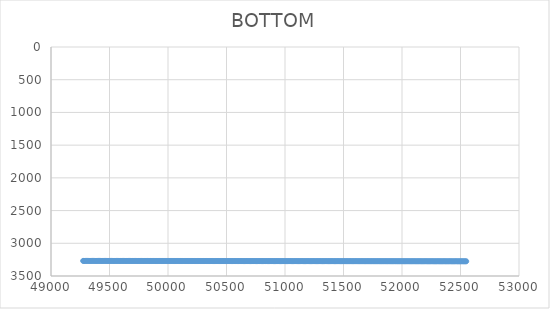
| Category | BOTTOM |
|---|---|
| 49275.0867 | 3269.27 |
| 49282.2205 | 3269.28 |
| 49292.46 | 3269.3 |
| 49302.7001 | 3269.32 |
| 49312.9402 | 3269.33 |
| 49323.1803 | 3269.35 |
| 49333.4204 | 3269.37 |
| 49343.6605 | 3269.39 |
| 49353.9006 | 3269.41 |
| 49364.1407 | 3269.43 |
| 49374.3808 | 3269.45 |
| 49384.6209 | 3269.46 |
| 49394.861 | 3269.48 |
| 49405.1011 | 3269.5 |
| 49415.3412 | 3269.52 |
| 49425.5813 | 3269.54 |
| 49435.8214 | 3269.56 |
| 49446.0615 | 3269.58 |
| 49456.3017 | 3269.59 |
| 49466.5418 | 3269.61 |
| 49476.7819 | 3269.63 |
| 49487.022 | 3269.65 |
| 49497.2621 | 3269.67 |
| 49507.5022 | 3269.69 |
| 49517.7423 | 3269.7 |
| 49527.9824 | 3269.72 |
| 49538.2225 | 3269.74 |
| 49548.4626 | 3269.76 |
| 49558.7027 | 3269.78 |
| 49568.9428 | 3269.8 |
| 49579.1829 | 3269.82 |
| 49589.423 | 3269.83 |
| 49599.6631 | 3269.85 |
| 49609.9032 | 3269.87 |
| 49620.1433 | 3269.89 |
| 49630.3834 | 3269.91 |
| 49640.6235 | 3269.93 |
| 49650.8636 | 3269.95 |
| 49661.1037 | 3269.96 |
| 49671.3438 | 3269.98 |
| 49681.5839 | 3270 |
| 49691.824 | 3270.02 |
| 49702.0641 | 3270.04 |
| 49712.3042 | 3270.06 |
| 49722.5443 | 3270.08 |
| 49732.7844 | 3270.09 |
| 49743.0245 | 3270.11 |
| 49753.2646 | 3270.13 |
| 49763.5047 | 3270.15 |
| 49773.7448 | 3270.17 |
| 49783.9849 | 3270.19 |
| 49794.225 | 3270.21 |
| 49804.4651 | 3270.22 |
| 49814.7052 | 3270.24 |
| 49824.9453 | 3270.26 |
| 49835.1854 | 3270.28 |
| 49845.4255 | 3270.3 |
| 49855.6656 | 3270.32 |
| 49865.9057 | 3270.34 |
| 49876.1458 | 3270.35 |
| 49886.3859 | 3270.37 |
| 49896.626 | 3270.39 |
| 49906.8661 | 3270.41 |
| 49917.1062 | 3270.43 |
| 49927.3463 | 3270.45 |
| 49937.5864 | 3270.46 |
| 49947.8265 | 3270.48 |
| 49958.0666 | 3270.5 |
| 49968.3067 | 3270.52 |
| 49978.5468 | 3270.54 |
| 49988.7869 | 3270.56 |
| 49999.027 | 3270.58 |
| 50009.2671 | 3270.59 |
| 50019.5072 | 3270.61 |
| 50029.7473 | 3270.63 |
| 50039.9874 | 3270.65 |
| 50050.2275 | 3270.67 |
| 50060.4676 | 3270.69 |
| 50070.7077 | 3270.71 |
| 50080.9478 | 3270.72 |
| 50091.1879 | 3270.74 |
| 50101.428 | 3270.76 |
| 50111.6681 | 3270.78 |
| 50121.9082 | 3270.8 |
| 50132.1483 | 3270.82 |
| 50142.3884 | 3270.84 |
| 50152.6285 | 3270.85 |
| 50162.8686 | 3270.87 |
| 50173.1087 | 3270.89 |
| 50183.3488 | 3270.91 |
| 50193.5889 | 3270.93 |
| 50203.8291 | 3270.95 |
| 50214.0692 | 3270.97 |
| 50224.3093 | 3270.98 |
| 50234.5494 | 3271 |
| 50244.7895 | 3271.02 |
| 50255.0296 | 3271.04 |
| 50265.2697 | 3271.06 |
| 50275.5098 | 3271.08 |
| 50285.7499 | 3271.1 |
| 50295.99 | 3271.11 |
| 50306.2301 | 3271.13 |
| 50316.4702 | 3271.15 |
| 50326.7103 | 3271.17 |
| 50336.9504 | 3271.19 |
| 50347.1905 | 3271.21 |
| 50357.4306 | 3271.22 |
| 50367.6707 | 3271.24 |
| 50377.9108 | 3271.26 |
| 50388.1509 | 3271.28 |
| 50398.391 | 3271.3 |
| 50408.6311 | 3271.32 |
| 50418.8712 | 3271.34 |
| 50429.1113 | 3271.35 |
| 50439.3514 | 3271.37 |
| 50449.5915 | 3271.39 |
| 50459.8316 | 3271.41 |
| 50470.0717 | 3271.43 |
| 50480.3118 | 3271.45 |
| 50490.5519 | 3271.47 |
| 50500.792 | 3271.48 |
| 50511.0321 | 3271.5 |
| 50521.2722 | 3271.52 |
| 50531.5123 | 3271.54 |
| 50541.7524 | 3271.56 |
| 50551.9925 | 3271.58 |
| 50562.2326 | 3271.6 |
| 50572.4727 | 3271.61 |
| 50582.7128 | 3271.63 |
| 50592.9529 | 3271.65 |
| 50603.193 | 3271.67 |
| 50613.4331 | 3271.69 |
| 50623.6732 | 3271.71 |
| 50633.9133 | 3271.73 |
| 50644.1534 | 3271.74 |
| 50654.3935 | 3271.76 |
| 50664.6336 | 3271.78 |
| 50674.8737 | 3271.8 |
| 50685.1138 | 3271.82 |
| 50695.3539 | 3271.84 |
| 50705.594 | 3271.86 |
| 50715.8341 | 3271.87 |
| 50726.0742 | 3271.89 |
| 50736.3143 | 3271.91 |
| 50746.5544 | 3271.93 |
| 50756.7945 | 3271.95 |
| 50767.0346 | 3271.97 |
| 50777.2747 | 3271.98 |
| 50787.5148 | 3272 |
| 50797.7549 | 3272.02 |
| 50807.995 | 3272.04 |
| 50818.2351 | 3272.06 |
| 50828.4752 | 3272.08 |
| 50838.7153 | 3272.1 |
| 50848.9554 | 3272.11 |
| 50859.1955 | 3272.13 |
| 50869.4356 | 3272.15 |
| 50879.6757 | 3272.17 |
| 50889.9158 | 3272.19 |
| 50900.1559 | 3272.21 |
| 50910.396 | 3272.23 |
| 50920.6361 | 3272.24 |
| 50930.8762 | 3272.26 |
| 50941.1163 | 3272.28 |
| 50951.3564 | 3272.3 |
| 50961.5965 | 3272.32 |
| 50971.8366 | 3272.34 |
| 50982.0768 | 3272.36 |
| 50992.3169 | 3272.37 |
| 51002.557 | 3272.39 |
| 51012.7971 | 3272.41 |
| 51023.0372 | 3272.43 |
| 51033.2773 | 3272.45 |
| 51043.5174 | 3272.47 |
| 51053.7575 | 3272.49 |
| 51063.9976 | 3272.5 |
| 51074.2377 | 3272.52 |
| 51084.4778 | 3272.54 |
| 51094.7179 | 3272.56 |
| 51104.958 | 3272.58 |
| 51115.1981 | 3272.6 |
| 51125.4382 | 3272.62 |
| 51135.6783 | 3272.63 |
| 51145.9184 | 3272.65 |
| 51156.1585 | 3272.67 |
| 51166.3986 | 3272.69 |
| 51176.6387 | 3272.71 |
| 51186.8788 | 3272.73 |
| 51197.1189 | 3272.74 |
| 51207.359 | 3272.76 |
| 51217.5991 | 3272.78 |
| 51227.8392 | 3272.8 |
| 51238.0793 | 3272.82 |
| 51248.3194 | 3272.84 |
| 51258.5595 | 3272.86 |
| 51268.7996 | 3272.87 |
| 51279.0397 | 3272.89 |
| 51289.2798 | 3272.91 |
| 51299.5199 | 3272.93 |
| 51309.76 | 3272.95 |
| 51320.0001 | 3272.97 |
| 51330.2402 | 3272.99 |
| 51340.4803 | 3273 |
| 51350.7204 | 3273.02 |
| 51360.9605 | 3273.04 |
| 51371.2006 | 3273.06 |
| 51381.4407 | 3273.08 |
| 51391.6808 | 3273.1 |
| 51401.9209 | 3273.12 |
| 51412.161 | 3273.13 |
| 51422.4011 | 3273.15 |
| 51432.6412 | 3273.17 |
| 51442.8813 | 3273.19 |
| 51453.1214 | 3273.21 |
| 51463.3615 | 3273.23 |
| 51473.6016 | 3273.25 |
| 51483.8417 | 3273.26 |
| 51494.0818 | 3273.28 |
| 51504.3219 | 3273.3 |
| 51514.562 | 3273.32 |
| 51524.8021 | 3273.34 |
| 51535.0422 | 3273.36 |
| 51545.2823 | 3273.38 |
| 51555.5224 | 3273.39 |
| 51565.7625 | 3273.41 |
| 51576.0026 | 3273.43 |
| 51586.2427 | 3273.45 |
| 51596.4828 | 3273.47 |
| 51606.7229 | 3273.49 |
| 51616.963 | 3273.5 |
| 51627.2031 | 3273.52 |
| 51637.4432 | 3273.54 |
| 51647.6833 | 3273.56 |
| 51657.9234 | 3273.58 |
| 51668.1635 | 3273.6 |
| 51678.4036 | 3273.62 |
| 51688.6437 | 3273.63 |
| 51698.8838 | 3273.65 |
| 51709.1239 | 3273.67 |
| 51719.364 | 3273.69 |
| 51729.6041 | 3273.71 |
| 51739.8442 | 3273.73 |
| 51750.0843 | 3273.75 |
| 51760.3244 | 3273.76 |
| 51770.5645 | 3273.78 |
| 51780.8046 | 3273.8 |
| 51791.0447 | 3273.82 |
| 51801.2849 | 3273.84 |
| 51811.525 | 3273.86 |
| 51821.7651 | 3273.88 |
| 51832.0052 | 3273.89 |
| 51842.2453 | 3273.91 |
| 51852.4854 | 3273.93 |
| 51862.7255 | 3273.95 |
| 51872.9656 | 3273.97 |
| 51883.2057 | 3273.99 |
| 51893.4458 | 3274.01 |
| 51903.6859 | 3274.02 |
| 51913.926 | 3274.04 |
| 51924.1661 | 3274.06 |
| 51934.4062 | 3274.08 |
| 51944.6463 | 3274.1 |
| 51954.8864 | 3274.12 |
| 51965.1265 | 3274.14 |
| 51975.3666 | 3274.15 |
| 51985.6067 | 3274.17 |
| 51995.8468 | 3274.19 |
| 52006.0869 | 3274.21 |
| 52016.327 | 3274.23 |
| 52026.5671 | 3274.25 |
| 52036.8072 | 3274.26 |
| 52047.0473 | 3274.28 |
| 52057.2874 | 3274.3 |
| 52067.5275 | 3274.32 |
| 52077.7676 | 3274.34 |
| 52088.0077 | 3274.36 |
| 52098.2478 | 3274.38 |
| 52108.4879 | 3274.39 |
| 52118.728 | 3274.41 |
| 52128.9681 | 3274.43 |
| 52139.2082 | 3274.45 |
| 52149.4483 | 3274.47 |
| 52159.6884 | 3274.49 |
| 52169.9285 | 3274.51 |
| 52180.1686 | 3274.52 |
| 52190.4087 | 3274.54 |
| 52200.6488 | 3274.56 |
| 52210.8889 | 3274.58 |
| 52221.129 | 3274.6 |
| 52231.3691 | 3274.62 |
| 52241.6092 | 3274.64 |
| 52251.8493 | 3274.65 |
| 52262.0894 | 3274.67 |
| 52272.3295 | 3274.69 |
| 52282.5696 | 3274.71 |
| 52292.8097 | 3274.73 |
| 52303.0498 | 3274.75 |
| 52313.2899 | 3274.77 |
| 52323.53 | 3274.78 |
| 52333.7701 | 3274.8 |
| 52344.0102 | 3274.82 |
| 52354.2503 | 3274.84 |
| 52364.4904 | 3274.86 |
| 52374.7305 | 3274.88 |
| 52384.9706 | 3274.9 |
| 52395.2107 | 3274.91 |
| 52405.4508 | 3274.93 |
| 52415.6909 | 3274.95 |
| 52425.931 | 3274.97 |
| 52436.1711 | 3274.99 |
| 52446.4112 | 3275.01 |
| 52456.6513 | 3275.03 |
| 52466.8914 | 3275.04 |
| 52477.1315 | 3275.06 |
| 52487.3716 | 3275.08 |
| 52497.6117 | 3275.1 |
| 52507.8518 | 3275.12 |
| 52518.0919 | 3275.14 |
| 52528.332 | 3275.15 |
| 52538.5721 | 3275.17 |
| 52548.7933 | 3275.19 |